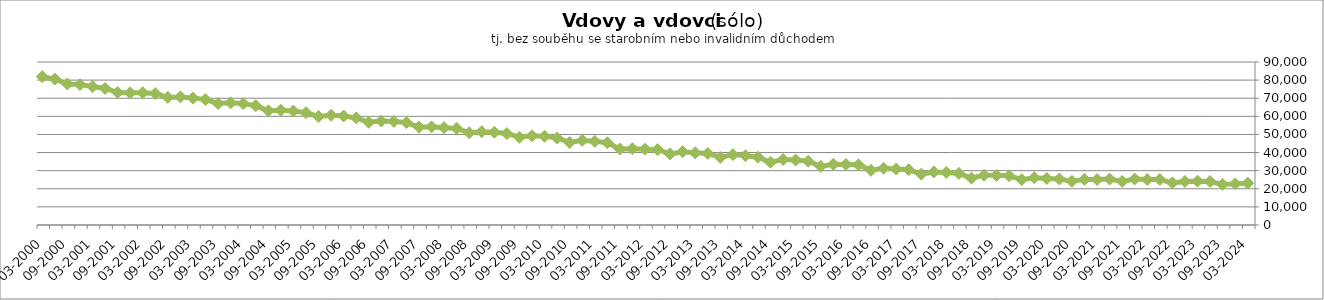
| Category | Series 0 |
|---|---|
| 03-2024 | 23141 |
| 12-2023 | 22708 |
| 09-2023 | 22397 |
| 06-2023 | 24032 |
| 03-2023 | 24183 |
| 12-2022 | 24031 |
| 09-2022 | 23271 |
| 06-2022 | 25158 |
| 03-2022 | 25108 |
| 12-2021 | 25413 |
| 09-2021 | 24076 |
| 06-2021 | 25368 |
| 03-2021 | 25104 |
| 12-2020 | 25179 |
| 09-2020 | 24123 |
| 06-2020 | 25403 |
| 03-2020 | 25682 |
| 12-2019 | 26103 |
| 09-2019 | 25007 |
| 06-2019 | 27197 |
| 03-2019 | 27407 |
| 12-2018 | 27439 |
| 09-2018 | 25855 |
| 06-2018 | 28480 |
| 03-2018 | 29027 |
| 12-2017 | 29266 |
| 09-2017 | 28066 |
| 06-2017 | 30540 |
| 03-2017 | 30901 |
| 12-2016 | 31304 |
| 09-2016 | 30205 |
| 06-2016 | 33214 |
| 03-2016 | 33452 |
| 12-2015 | 33545 |
| 09-2015 | 32379 |
| 06-2015 | 35202 |
| 03-2015 | 35871 |
| 12-2014 | 36205 |
| 09-2014 | 34615 |
| 06-2014 | 37458 |
| 03-2014 | 38241 |
| 12-2013 | 38863 |
| 09-2013 | 37308 |
| 06-2013 | 39543 |
| 03-2013 | 39855 |
| 12-2012 | 40471 |
| 09-2012 | 39222 |
| 06-2012 | 41642 |
| 03-2012 | 41843 |
| 12-2011 | 42131 |
| 09-2011 | 41957 |
| 06-2011 | 45409 |
| 03-2011 | 46228 |
| 12-2010 | 46711 |
| 09-2010 | 45576 |
| 06-2010 | 48049 |
| 03-2010 | 48999 |
| 12-2009 | 49281 |
| 09-2009 | 48426 |
| 06-2009 | 50475 |
| 03-2009 | 51222 |
| 12-2008 | 51507 |
| 09-2008 | 50932 |
| 06-2008 | 53339 |
| 03-2008 | 53762 |
| 12-2007 | 54195 |
| 09-2007 | 54031 |
| 06-2007 | 56555 |
| 03-2007 | 57198 |
| 12-2006 | 57411 |
| 09-2006 | 56708 |
| 06-2006 | 59147 |
| 03-2006 | 60177 |
| 12-2005 | 60632 |
| 09-2005 | 59906 |
| 06-2005 | 62019 |
| 03-2005 | 62924 |
| 12-2004 | 63374 |
| 09-2004 | 63082 |
| 06-2004 | 65903 |
| 03-2004 | 67021 |
| 12-2003 | 67438 |
| 09-2003 | 67057 |
| 06-2003 | 69261 |
| 03-2003 | 70062 |
| 12-2002 | 70729 |
| 09-2002 | 70459 |
| 06-2002 | 72581 |
| 03-2002 | 73062 |
| 12-2001 | 72998 |
| 09-2001 | 73205 |
| 06-2001 | 75394 |
| 03-2001 | 76494 |
| 12-2000 | 77545 |
| 09-2000 | 77874 |
| 06-2000 | 80586 |
| 03-2000 | 81947 |